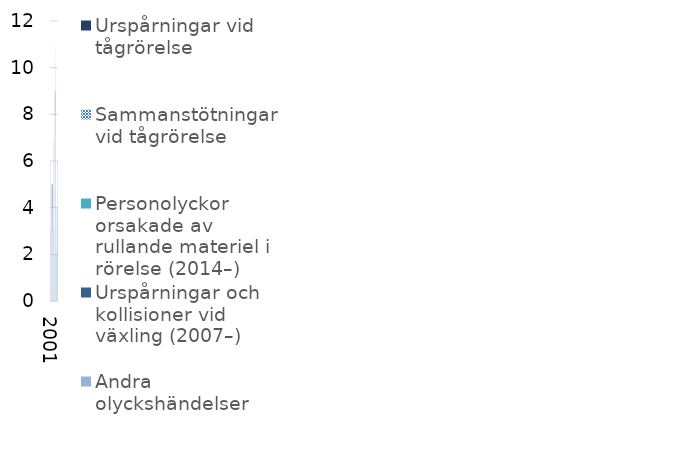
| Category | Andra olyckshändelser | Urspårningar och kollisioner vid växling (2007–) | Personolyckor orsakade av rullande materiel i rörelse (2014–) | Sammanstötningar vid tågrörelse | Urspårningar vid tågrörelse |
|---|---|---|---|---|---|
| 2001 | 3 | 0 | 0 | 0 | 0 |
| 2002 | 6 | 0 | 0 | 0 | 0 |
| 2003 | 5 | 0 | 0 | 0 | 0 |
| 2004 | 5 | 0 | 0 | 0 | 0 |
| 2005 | 3 | 0 | 0 | 0 | 2 |
| 2006 | 4 | 0 | 0 | 0 | 1 |
| 2007 | 3 | 0 | 0 | 0 | 0 |
| 2008 | 7 | 0 | 0 | 0 | 0 |
| 2009 | 2 | 0 | 0 | 0 | 0 |
| 2010 | 9 | 0 | 0 | 0 | 0 |
| 2011 | 10 | 0 | 0 | 1 | 0 |
| 2012 | 8 | 1 | 0 | 0 | 0 |
| 2013 | 4 | 0 | 0 | 0 | 0 |
| 2014 | 0 | 0 | 2 | 0 | 0 |
| 2015 | 0 | 0 | 6 | 0 | 0 |
| 2016 | 0 | 0 | 4 | 0 | 0 |